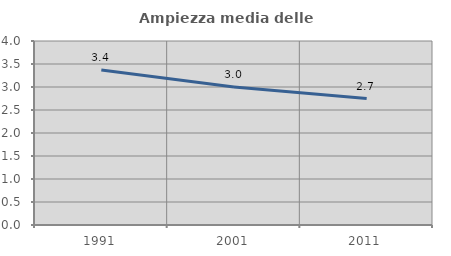
| Category | Ampiezza media delle famiglie |
|---|---|
| 1991.0 | 3.369 |
| 2001.0 | 2.999 |
| 2011.0 | 2.748 |